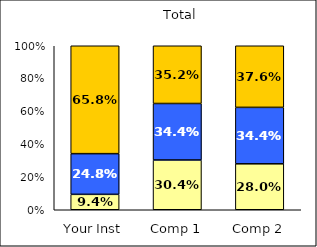
| Category | Low College Reputation Orientation | Average College Reputation Orientation | High College Reputation Orientation |
|---|---|---|---|
| Your Inst | 0.094 | 0.248 | 0.658 |
| Comp 1 | 0.304 | 0.344 | 0.352 |
| Comp 2 | 0.28 | 0.344 | 0.376 |